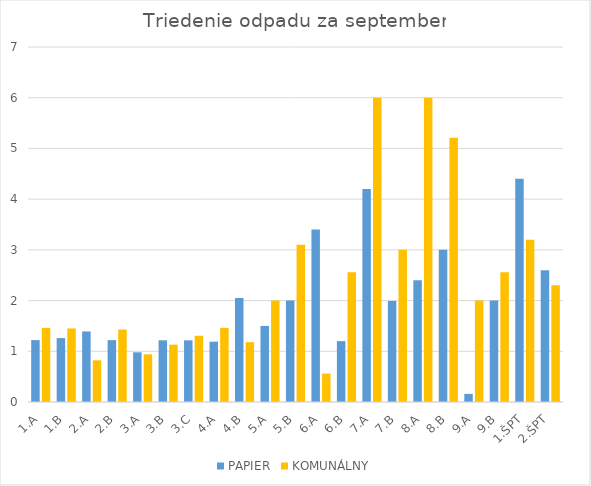
| Category | PAPIER | KOMUNÁLNY |
|---|---|---|
| 1.A | 1.221 | 1.462 |
| 1.B | 1.26 | 1.45 |
| 2.A | 1.391 | 0.822 |
| 2.B | 1.22 | 1.43 |
| 3.A | 0.98 | 0.94 |
| 3.B | 1.217 | 1.13 |
| 3.C | 1.216 | 1.306 |
| 4.A | 1.189 | 1.462 |
| 4.B | 2.053 | 1.18 |
| 5.A | 1.5 | 2 |
| 5.B | 2 | 3.1 |
| 6.A | 3.4 | 0.56 |
| 6.B | 1.2 | 2.56 |
| 7.A | 4.2 | 6 |
| 7.B | 1.99 | 3 |
| 8.A | 2.4 | 6 |
| 8.B | 3 | 5.21 |
| 9.A | 0.16 | 2 |
| 9.B | 2 | 2.56 |
| 1.ŠPT | 4.4 | 3.2 |
| 2.ŠPT | 2.6 | 2.3 |